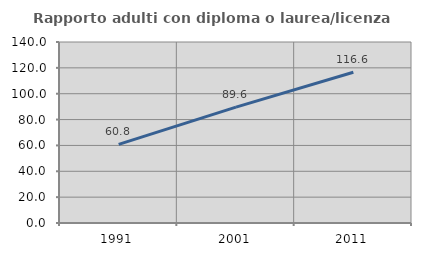
| Category | Rapporto adulti con diploma o laurea/licenza media  |
|---|---|
| 1991.0 | 60.784 |
| 2001.0 | 89.649 |
| 2011.0 | 116.562 |